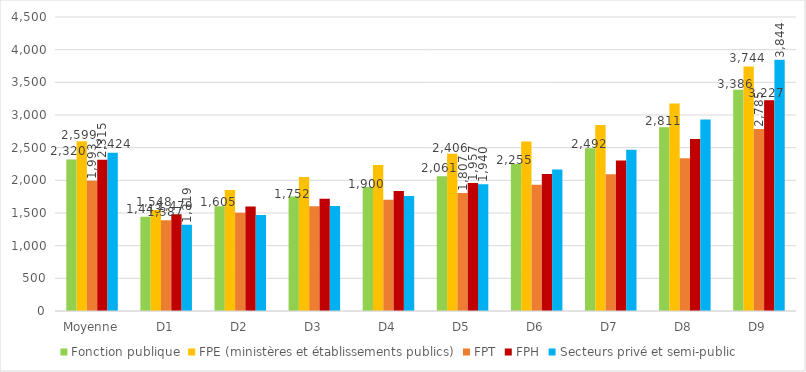
| Category | Fonction publique | FPE (ministères et établissements publics) | FPT | FPH | Secteurs privé et semi-public  |
|---|---|---|---|---|---|
| Moyenne | 2319.5 | 2599.12 | 1993.07 | 2315 | 2424.1 |
| D1 | 1442.71 | 1547.67 | 1387.32 | 1479 | 1318.9 |
| D2 | 1604.79 | 1853.9 | 1505.58 | 1600.67 | 1469.1 |
| D3 | 1752.33 | 2052.83 | 1604.67 | 1718.47 | 1606.1 |
| D4 | 1899.83 | 2233.83 | 1702.02 | 1836.42 | 1759.1 |
| D5 | 2061.33 | 2406.02 | 1807.42 | 1957.42 | 1940.2 |
| D6 | 2254.92 | 2595.01 | 1930.58 | 2096.75 | 2164.6 |
| D7 | 2492.18 | 2845.28 | 2091.31 | 2305.17 | 2467.7 |
| D8 | 2811.3 | 3174.92 | 2339 | 2634.08 | 2929.4 |
| D9 | 3385.67 | 3743.79 | 2784.85 | 3226.97 | 3844.1 |